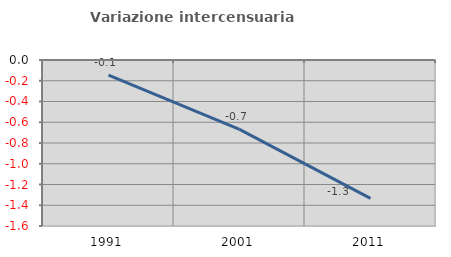
| Category | Variazione intercensuaria annua |
|---|---|
| 1991.0 | -0.146 |
| 2001.0 | -0.668 |
| 2011.0 | -1.334 |